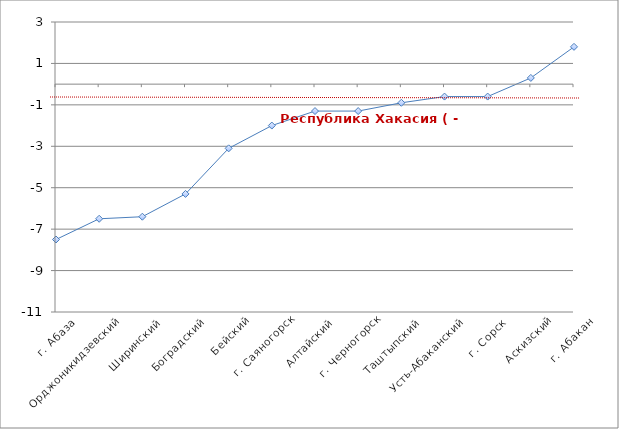
| Category | Series 0 |
|---|---|
| г. Абаза | -7.5 |
| Орджоникидзевский | -6.5 |
| Ширинский | -6.4 |
| Боградский | -5.3 |
| Бейский | -3.1 |
| г. Саяногорск | -2 |
| Алтайский | -1.3 |
| г. Черногорск | -1.3 |
| Таштыпский | -0.9 |
| Усть-Абаканский | -0.6 |
| г. Сорск | -0.6 |
| Аскизский | 0.3 |
| г. Абакан | 1.8 |